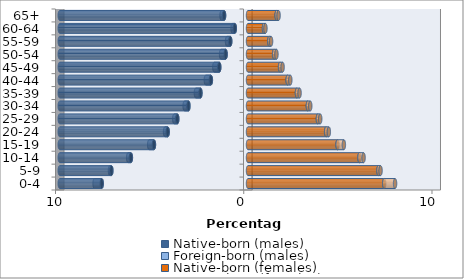
| Category | Native-born (males) | Foreign-born (males) | Native-born (females) | Foreign-born (females) |
|---|---|---|---|---|
| 0-4 | -7.771 | -0.379 | 7.236 | 0.577 |
| 5-9 | -7.26 | -0.074 | 6.929 | 0.113 |
| 10-14 | -6.222 | -0.144 | 5.92 | 0.22 |
| 15-19 | -4.997 | -0.253 | 4.757 | 0.337 |
| 20-24 | -4.266 | -0.141 | 4.15 | 0.144 |
| 25-29 | -3.758 | -0.161 | 3.712 | 0.125 |
| 30-34 | -3.165 | -0.201 | 3.179 | 0.129 |
| 35-39 | -2.527 | -0.242 | 2.6 | 0.139 |
| 40-44 | -1.973 | -0.267 | 2.105 | 0.143 |
| 45-49 | -1.527 | -0.263 | 1.703 | 0.135 |
| 50-54 | -1.188 | -0.241 | 1.387 | 0.125 |
| 55-59 | -0.943 | -0.17 | 1.13 | 0.096 |
| 60-64 | -0.702 | -0.119 | 0.85 | 0.078 |
| 65+ | -1.272 | -0.133 | 1.522 | 0.103 |